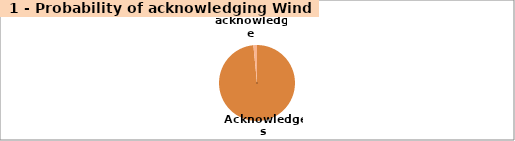
| Category | Series 0 |
|---|---|
| Acknowledges | 0.985 |
| Does not acknowledge | 0.015 |